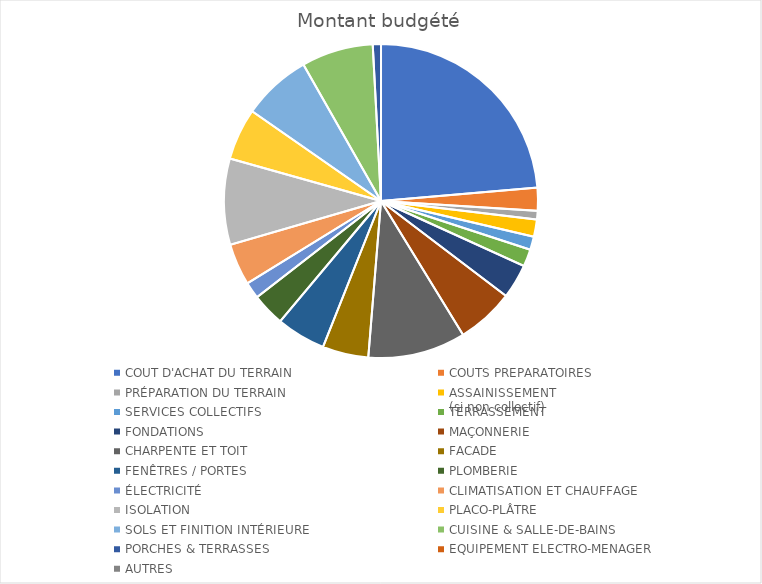
| Category |  Montant budgété  |
|---|---|
| COUT D'ACHAT DU TERRAIN | 80000 |
| COUTS PREPARATOIRES | 8000 |
| PRÉPARATION DU TERRAIN | 3000 |
| ASSAINISSEMENT 
(si non collectif) | 6000 |
| SERVICES COLLECTIFS | 4600 |
| TERRASSEMENT | 6000 |
| FONDATIONS | 12000 |
| MAÇONNERIE | 20000 |
| CHARPENTE ET TOIT | 34000 |
| FACADE | 16000 |
| FENÊTRES / PORTES | 17200 |
| PLOMBERIE | 11500 |
| ÉLECTRICITÉ | 5800 |
| CLIMATISATION ET CHAUFFAGE | 14500 |
| ISOLATION | 30000 |
| PLACO-PLÂTRE | 18000 |
| SOLS ET FINITION INTÉRIEURE | 24000 |
| CUISINE & SALLE-DE-BAINS | 25000 |
| PORCHES & TERRASSES | 2850 |
| EQUIPEMENT ELECTRO-MENAGER | 0 |
| AUTRES | 0 |